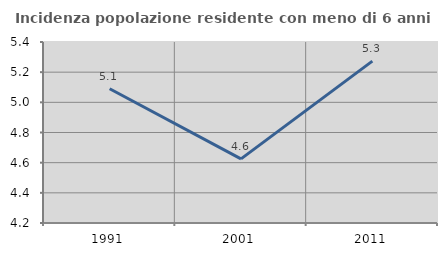
| Category | Incidenza popolazione residente con meno di 6 anni |
|---|---|
| 1991.0 | 5.09 |
| 2001.0 | 4.625 |
| 2011.0 | 5.273 |